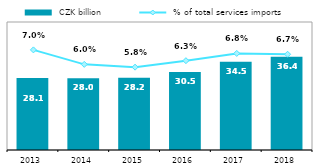
| Category |  CZK billion |
|---|---|
| 2013.0 | 28.087 |
| 2014.0 | 28.015 |
| 2015.0 | 28.178 |
| 2016.0 | 30.464 |
| 2017.0 | 34.466 |
| 2018.0 | 36.4 |